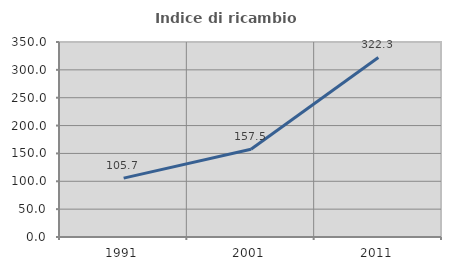
| Category | Indice di ricambio occupazionale  |
|---|---|
| 1991.0 | 105.68 |
| 2001.0 | 157.477 |
| 2011.0 | 322.277 |